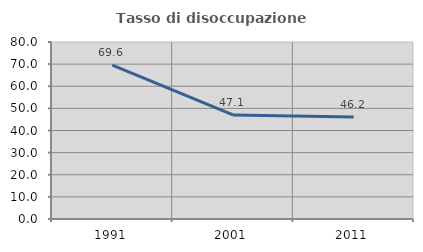
| Category | Tasso di disoccupazione giovanile  |
|---|---|
| 1991.0 | 69.565 |
| 2001.0 | 47.059 |
| 2011.0 | 46.154 |